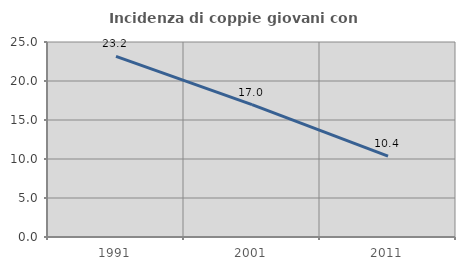
| Category | Incidenza di coppie giovani con figli |
|---|---|
| 1991.0 | 23.154 |
| 2001.0 | 16.968 |
| 2011.0 | 10.374 |